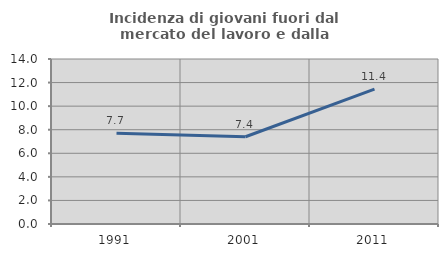
| Category | Incidenza di giovani fuori dal mercato del lavoro e dalla formazione  |
|---|---|
| 1991.0 | 7.705 |
| 2001.0 | 7.4 |
| 2011.0 | 11.443 |